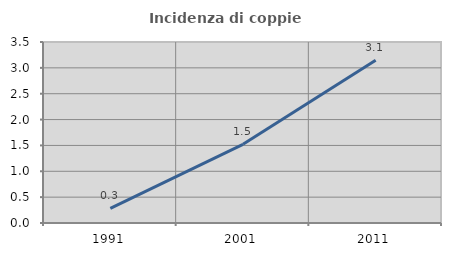
| Category | Incidenza di coppie miste |
|---|---|
| 1991.0 | 0.284 |
| 2001.0 | 1.521 |
| 2011.0 | 3.149 |